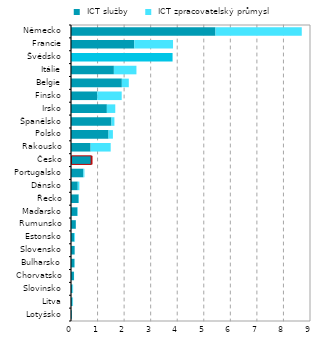
| Category |  ICT služby |  ICT zpracovatelský průmysl |
|---|---|---|
| Lotyšsko | 0.031 | 0.004 |
| Litva | 0.056 | 0.021 |
| Slovinsko | 0.051 | 0.029 |
| Chorvatsko | 0.111 | 0.004 |
| Bulharsko | 0.132 | 0.007 |
| Slovensko | 0.138 | 0.004 |
| Estonsko | 0.118 | 0.033 |
| Rumunsko | 0.182 | 0.002 |
| Maďarsko | 0.241 | 0.014 |
| Řecko | 0.288 | 0.011 |
| Dánsko | 0.255 | 0.061 |
| Portugalsko | 0.466 | 0.04 |
| Česko | 0.759 | 0.028 |
| Rakousko | 0.739 | 0.756 |
| Polsko | 1.414 | 0.165 |
| Španělsko | 1.525 | 0.109 |
| Irsko | 1.351 | 0.317 |
| Finsko | 0.989 | 0.921 |
| Belgie | 1.915 | 0.262 |
| Itálie | 1.615 | 0.85 |
| Švédsko | 3.825 | 0 |
| Francie | 2.383 | 1.459 |
| Německo | 5.441 | 3.25 |